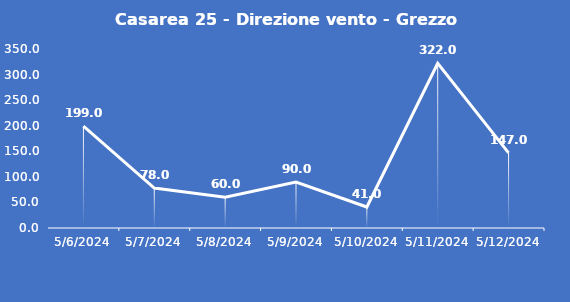
| Category | Casarea 25 - Direzione vento - Grezzo (°N) |
|---|---|
| 5/6/24 | 199 |
| 5/7/24 | 78 |
| 5/8/24 | 60 |
| 5/9/24 | 90 |
| 5/10/24 | 41 |
| 5/11/24 | 322 |
| 5/12/24 | 147 |